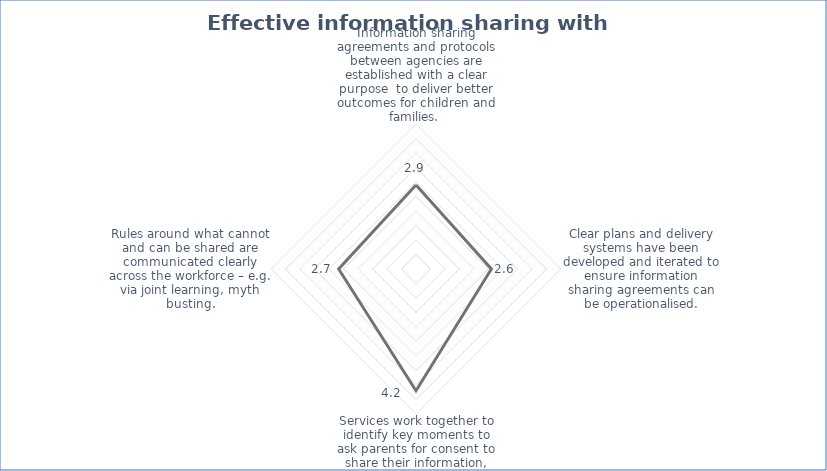
| Category | Series 0 |
|---|---|
| Information sharing agreements and protocols between agencies are established with a clear purpose  to deliver better outcomes for children and families.  | 2.9 |
| Clear plans and delivery systems have been developed and iterated to ensure information sharing agreements can be operationalised. | 2.6 |
| Services work together to identify key moments to ask parents for consent to share their information, and this takes place. | 4.2 |
| Rules around what cannot and can be shared are communicated clearly across the workforce – e.g. via joint learning, myth busting. | 2.667 |